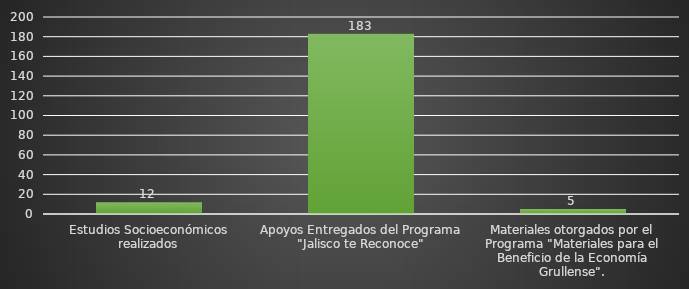
| Category | INDICADOR  |
|---|---|
| Estudios Socioeconómicos realizados | 12 |
| Apoyos Entregados del Programa "Jalisco te Reconoce" | 183 |
| Materiales otorgados por el Programa "Materiales para el Beneficio de la Economía Grullense". | 5 |